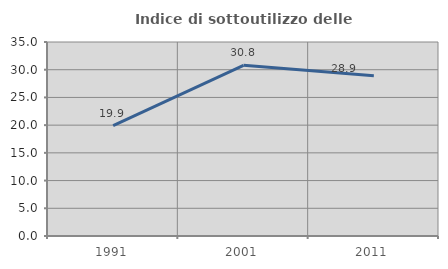
| Category | Indice di sottoutilizzo delle abitazioni  |
|---|---|
| 1991.0 | 19.911 |
| 2001.0 | 30.8 |
| 2011.0 | 28.909 |